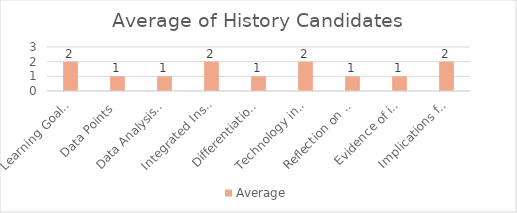
| Category | Average |
|---|---|
| Learning Goals Aligned with Pre-/Post-assessments ACEI 4.0 | 2 |
| Data Points | 1 |
| Data Analysis for Pedagogical Decisions ACEI 4.0 | 1 |
| Integrated Instruction ACEI 3.1 | 2 |
| Differentiation based on knowledge of individual learning ACEI 3.2 | 1 |
| Technology integration | 2 |
| Reflection on pedagogical decisions ACEI 1.0 | 1 |
| Evidence of impact on student learning ACEI 5.1 | 1 |
| Implications for teaching and professional development ACEI 5.1 | 2 |